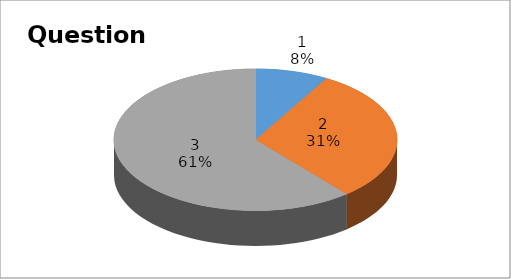
| Category | Series 0 |
|---|---|
| 0 | 3 |
| 1 | 11 |
| 2 | 22 |